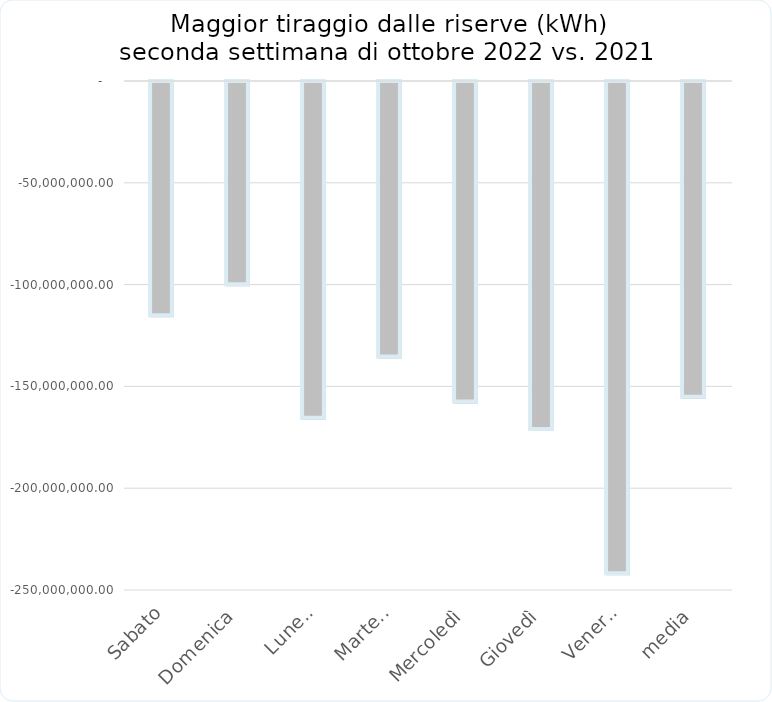
| Category | Series 0 |
|---|---|
| Sabato | -115537498.339 |
| Domenica | -100353247.098 |
| Lunedì | -165865295.925 |
| Martedì | -135789663.977 |
| Mercoledì | -157857828.456 |
| Giovedì | -171433487.738 |
| Venerdì | -242275434.03 |
| media | -155587493.652 |